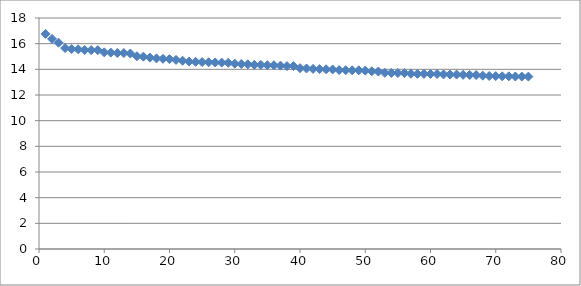
| Category | Series 0 |
|---|---|
| 1.0 | 16.76 |
| 2.0 | 16.371 |
| 3.0 | 16.074 |
| 4.0 | 15.656 |
| 5.0 | 15.58 |
| 6.0 | 15.561 |
| 7.0 | 15.505 |
| 8.0 | 15.498 |
| 9.0 | 15.494 |
| 10.0 | 15.325 |
| 11.0 | 15.303 |
| 12.0 | 15.27 |
| 13.0 | 15.268 |
| 14.0 | 15.23 |
| 15.0 | 15.023 |
| 16.0 | 14.988 |
| 17.0 | 14.914 |
| 18.0 | 14.851 |
| 19.0 | 14.821 |
| 20.0 | 14.797 |
| 21.0 | 14.734 |
| 22.0 | 14.67 |
| 23.0 | 14.607 |
| 24.0 | 14.583 |
| 25.0 | 14.562 |
| 26.0 | 14.552 |
| 27.0 | 14.536 |
| 28.0 | 14.524 |
| 29.0 | 14.51 |
| 30.0 | 14.439 |
| 31.0 | 14.414 |
| 32.0 | 14.388 |
| 33.0 | 14.355 |
| 34.0 | 14.347 |
| 35.0 | 14.321 |
| 36.0 | 14.318 |
| 37.0 | 14.286 |
| 38.0 | 14.254 |
| 39.0 | 14.253 |
| 40.0 | 14.088 |
| 41.0 | 14.067 |
| 42.0 | 14.034 |
| 43.0 | 14.019 |
| 44.0 | 14.003 |
| 45.0 | 13.99 |
| 46.0 | 13.941 |
| 47.0 | 13.933 |
| 48.0 | 13.927 |
| 49.0 | 13.925 |
| 50.0 | 13.901 |
| 51.0 | 13.849 |
| 52.0 | 13.827 |
| 53.0 | 13.728 |
| 54.0 | 13.72 |
| 55.0 | 13.716 |
| 56.0 | 13.705 |
| 57.0 | 13.658 |
| 58.0 | 13.648 |
| 59.0 | 13.648 |
| 60.0 | 13.639 |
| 61.0 | 13.637 |
| 62.0 | 13.603 |
| 63.0 | 13.593 |
| 64.0 | 13.59 |
| 65.0 | 13.569 |
| 66.0 | 13.563 |
| 67.0 | 13.554 |
| 68.0 | 13.507 |
| 69.0 | 13.481 |
| 70.0 | 13.474 |
| 71.0 | 13.458 |
| 72.0 | 13.457 |
| 73.0 | 13.44 |
| 74.0 | 13.434 |
| 75.0 | 13.432 |